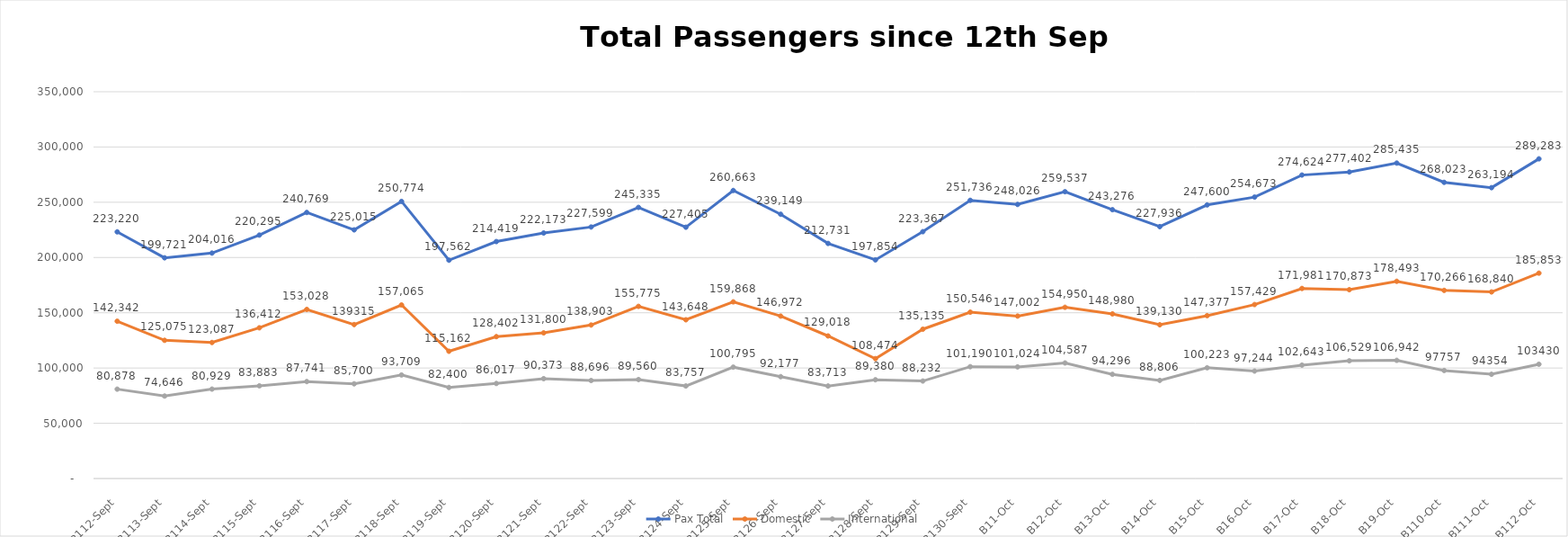
| Category | Pax Total |  Domestic  |  International  |
|---|---|---|---|
| 2022-09-12 | 223219.7 | 142341.7 | 80878 |
| 2022-09-13 | 199721 | 125075 | 74646 |
| 2022-09-14 | 204016 | 123087 | 80929 |
| 2022-09-15 | 220295 | 136412 | 83883 |
| 2022-09-16 | 240769 | 153028 | 87741 |
| 2022-09-17 | 225015 | 139315 | 85700 |
| 2022-09-18 | 250774 | 157065 | 93709 |
| 2022-09-19 | 197562 | 115162 | 82400 |
| 2022-09-20 | 214419 | 128402 | 86017 |
| 2022-09-21 | 222173 | 131800 | 90373 |
| 2022-09-22 | 227599 | 138903 | 88696 |
| 2022-09-23 | 245335 | 155775 | 89560 |
| 2022-09-24 | 227405 | 143648 | 83757 |
| 2022-09-25 | 260663 | 159868 | 100795 |
| 2022-09-26 | 239149 | 146972 | 92177 |
| 2022-09-27 | 212731 | 129018 | 83713 |
| 2022-09-28 | 197854 | 108474 | 89380 |
| 2022-09-29 | 223367 | 135135 | 88232 |
| 2022-09-30 | 251736 | 150546 | 101190 |
| 2022-10-01 | 248026 | 147002 | 101024 |
| 2022-10-02 | 259537 | 154950 | 104587 |
| 2022-10-03 | 243276 | 148980 | 94296 |
| 2022-10-04 | 227936 | 139130 | 88806 |
| 2022-10-05 | 247600 | 147377 | 100223 |
| 2022-10-06 | 254673 | 157429 | 97244 |
| 2022-10-07 | 274624 | 171981 | 102643 |
| 2022-10-08 | 277402 | 170873 | 106529 |
| 2022-10-09 | 285435 | 178493 | 106942 |
| 2022-10-10 | 268023 | 170266 | 97757 |
| 2022-10-11 | 263194 | 168840 | 94354 |
| 2022-10-12 | 289283 | 185853 | 103430 |